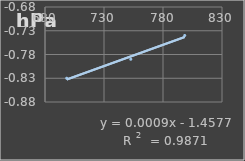
| Category | Presión Admosferica |
|---|---|
| 698.4 | -0.83 |
| 752.7 | -0.79 |
| 798.4 | -0.74 |